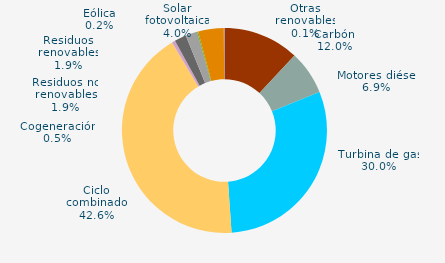
| Category | Series 0 |
|---|---|
| Carbón | 11.963 |
| Motores diésel | 6.914 |
| Turbina de gas | 30.026 |
| Ciclo combinado | 42.552 |
| Generación auxiliar | 0 |
| Cogeneración | 0.52 |
| Residuos no renovables | 1.855 |
| Residuos renovables | 1.855 |
| Eólica | 0.18 |
| Solar fotovoltaica | 4.03 |
| Otras renovables | 0.106 |